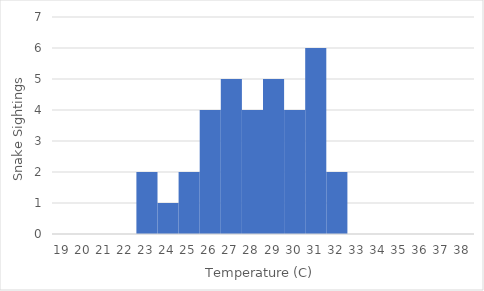
| Category | Snake Sightings |
|---|---|
| 19.0 | 0 |
| 20.0 | 0 |
| 21.0 | 0 |
| 22.0 | 0 |
| 23.0 | 2 |
| 24.0 | 1 |
| 25.0 | 2 |
| 26.0 | 4 |
| 27.0 | 5 |
| 28.0 | 4 |
| 29.0 | 5 |
| 30.0 | 4 |
| 31.0 | 6 |
| 32.0 | 2 |
| 33.0 | 0 |
| 34.0 | 0 |
| 35.0 | 0 |
| 36.0 | 0 |
| 37.0 | 0 |
| 38.0 | 0 |